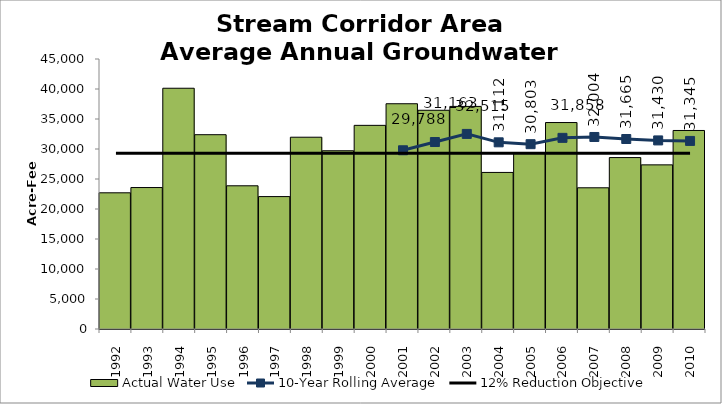
| Category | Actual Water Use |
|---|---|
| 1992.0 | 22699.7 |
| 1993.0 | 23578.01 |
| 1994.0 | 40125.29 |
| 1995.0 | 32383.19 |
| 1996.0 | 23868.51 |
| 1997.0 | 22068.1 |
| 1998.0 | 31963.96 |
| 1999.0 | 29705.86 |
| 2000.0 | 33941.08 |
| 2001.0 | 37542.34 |
| 2002.0 | 36455.24 |
| 2003.0 | 37098.07 |
| 2004.0 | 26095.92 |
| 2005.0 | 29293.82 |
| 2006.0 | 34411.3 |
| 2007.0 | 23535.85 |
| 2008.0 | 28571.6 |
| 2009.0 | 27354.49 |
| 2010.0 | 33087.27 |